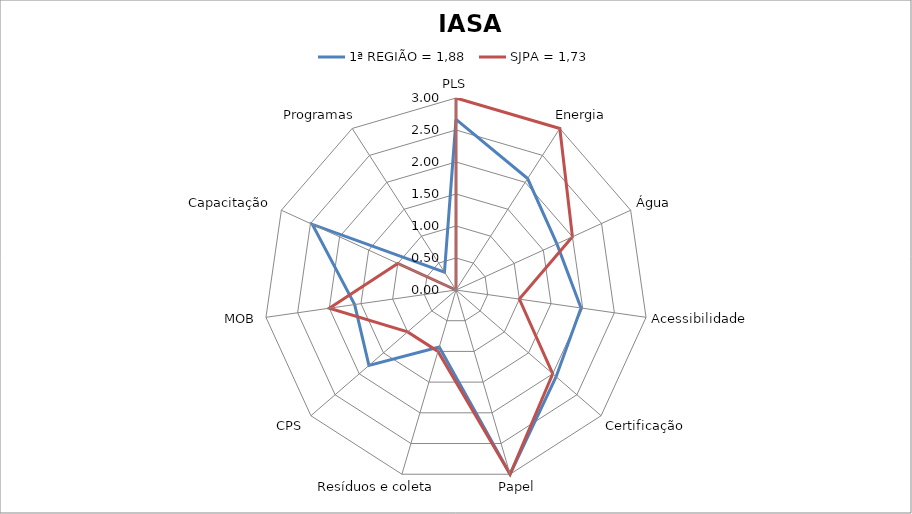
| Category | 1ª REGIÃO = 1,88 | SJPA = 1,73 |
|---|---|---|
| PLS | 2.667 | 3 |
| Energia | 2.07 | 3 |
| Água | 1.733 | 2 |
| Acessibilidade | 1.973 | 1 |
| Certificação | 2.07 | 2 |
| Papel | 3 | 3 |
| Resíduos e coleta | 0.93 | 1 |
| CPS | 1.8 | 1 |
| MOB | 1.6 | 2 |
| Capacitação | 2.467 | 1 |
| Programas | 0.333 | 0 |